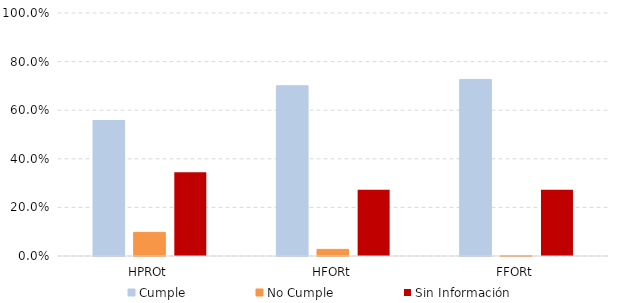
| Category | Cumple | No Cumple | Sin Información |
|---|---|---|---|
| HPROt | 0.558 | 0.097 | 0.345 |
| HFORt | 0.701 | 0.027 | 0.272 |
| FFORt | 0.726 | 0.001 | 0.272 |